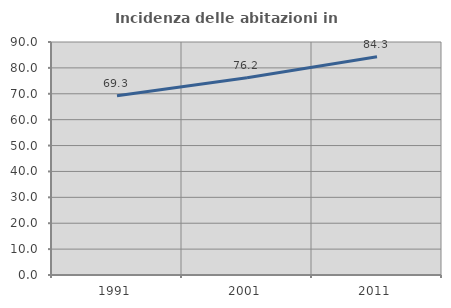
| Category | Incidenza delle abitazioni in proprietà  |
|---|---|
| 1991.0 | 69.258 |
| 2001.0 | 76.19 |
| 2011.0 | 84.267 |